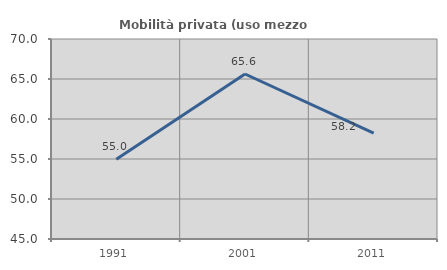
| Category | Mobilità privata (uso mezzo privato) |
|---|---|
| 1991.0 | 54.967 |
| 2001.0 | 65.625 |
| 2011.0 | 58.242 |